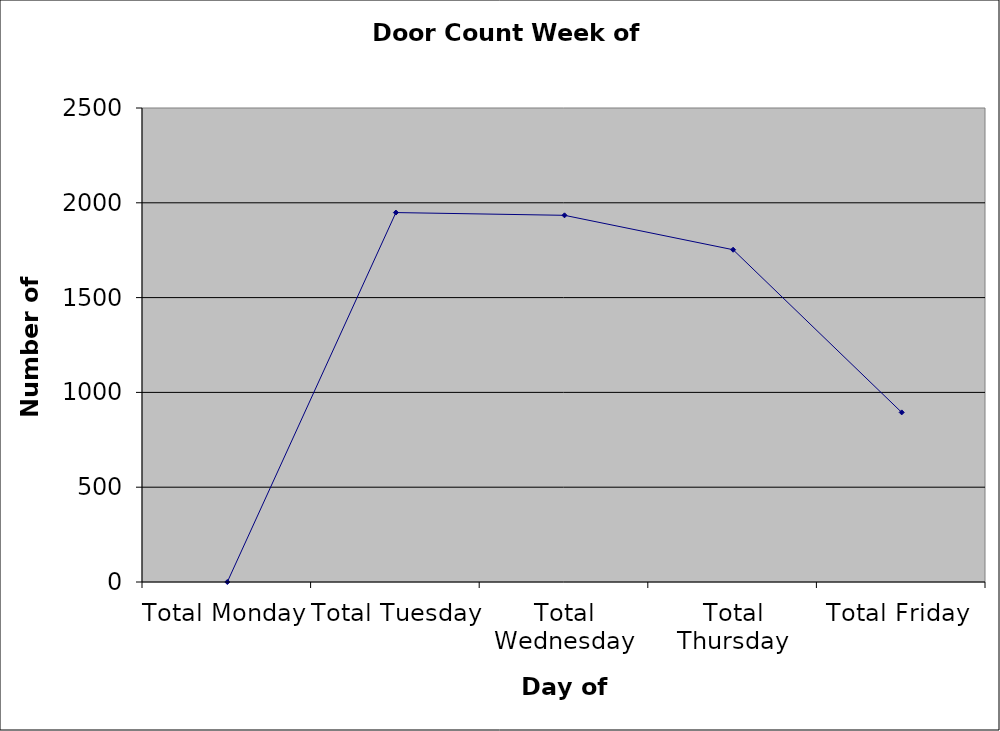
| Category | Series 0 |
|---|---|
| Total Monday | 0 |
| Total Tuesday | 1948.5 |
| Total Wednesday | 1934 |
| Total Thursday | 1752.5 |
| Total Friday | 894.5 |